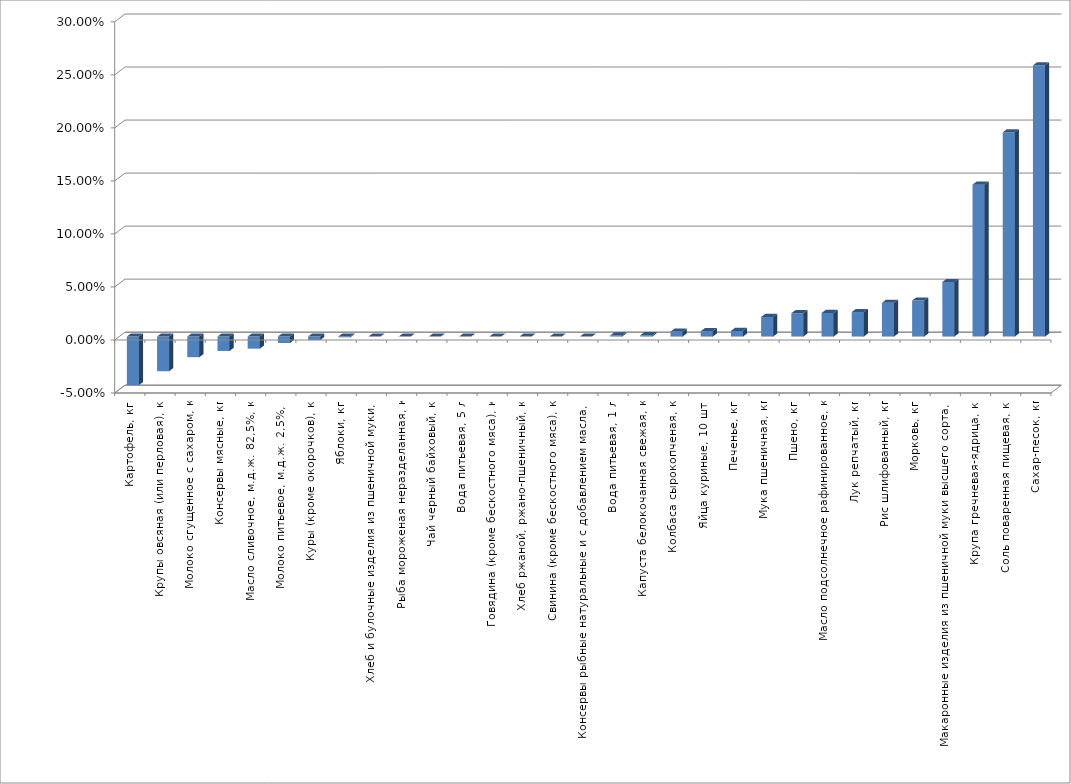
| Category | Series 0 |
|---|---|
| Картофель, кг | -0.046 |
| Крупы овсяная (или перловая), кг | -0.033 |
| Молоко сгущенное с сахаром, кг | -0.019 |
| Консервы мясные, кг | -0.014 |
| Масло сливочное, м.д.ж. 82,5%, кг | -0.011 |
| Молоко питьевое, м.д.ж. 2,5%, л | -0.006 |
| Куры (кроме окорочков), кг | -0.003 |
| Яблоки, кг | -0.001 |
| Хлеб и булочные изделия из пшеничной муки, кг | 0 |
| Рыба мороженая неразделанная, кг | 0 |
| Чай черный байховый, кг | 0 |
| Вода питьевая, 5 л | 0 |
| Говядина (кроме бескостного мяса), кг | 0 |
| Хлеб ржаной, ржано-пшеничный, кг | 0 |
| Свинина (кроме бескостного мяса), кг | 0 |
| Консервы рыбные натуральные и с добавлением масла, кг | 0 |
| Вода питьевая, 1 л | 0.001 |
| Капуста белокочанная свежая, кг | 0.001 |
| Колбаса сырокопченая, кг | 0.005 |
| Яйца куриные, 10 шт. | 0.005 |
| Печенье, кг | 0.005 |
| Мука пшеничная, кг | 0.018 |
| Пшено, кг | 0.022 |
| Масло подсолнечное рафинированное, кг | 0.022 |
| Лук репчатый, кг | 0.023 |
| Рис шлифованный, кг | 0.032 |
| Морковь, кг | 0.034 |
| Макаронные изделия из пшеничной муки высшего сорта, кг | 0.051 |
| Крупа гречневая-ядрица, кг | 0.143 |
| Соль поваренная пищевая, кг | 0.193 |
| Сахар-песок, кг | 0.256 |